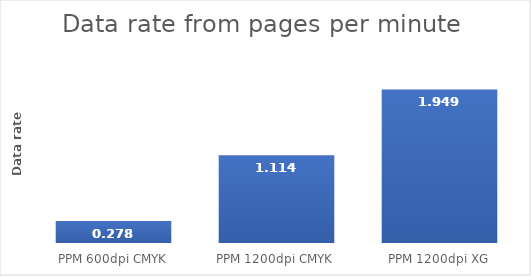
| Category | Series 0 |
|---|---|
| PPM 600dpi CMYK | 0.278 |
| PPM 1200dpi CMYK | 1.114 |
| PPM 1200dpi XG | 1.949 |